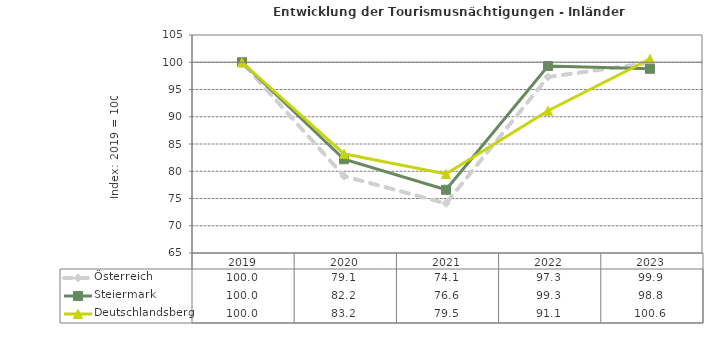
| Category | Österreich | Steiermark | Deutschlandsberg |
|---|---|---|---|
| 2023.0 | 99.9 | 98.8 | 100.6 |
| 2022.0 | 97.3 | 99.3 | 91.1 |
| 2021.0 | 74.1 | 76.6 | 79.5 |
| 2020.0 | 79.1 | 82.2 | 83.2 |
| 2019.0 | 100 | 100 | 100 |